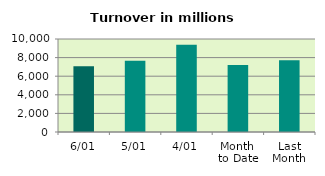
| Category | Series 0 |
|---|---|
| 6/01 | 7057.623 |
| 5/01 | 7654.261 |
| 4/01 | 9390.9 |
| Month 
to Date | 7210.509 |
| Last
Month | 7707.734 |